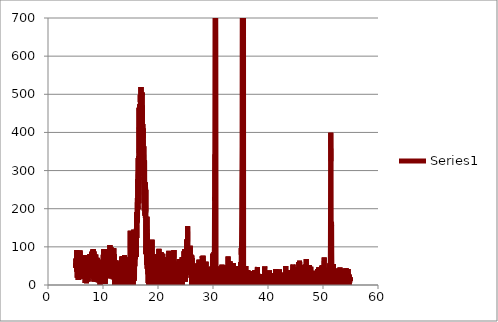
| Category | Series 0 |
|---|---|
| 5.01 | 57.4 |
| 5.03 | 44.9 |
| 5.05 | 57.3 |
| 5.07 | 69.4 |
| 5.09 | 67.3 |
| 5.11 | 54.8 |
| 5.13 | 53.4 |
| 5.15 | 51.7 |
| 5.17 | 62.1 |
| 5.19 | 56.9 |
| 5.21 | 77.2 |
| 5.23 | 91.5 |
| 5.25 | 35.1 |
| 5.27 | 86.2 |
| 5.29 | 45.9 |
| 5.31 | 18.8 |
| 5.33 | 63.1 |
| 5.35 | 52.1 |
| 5.37 | 83.4 |
| 5.39 | 27.9 |
| 5.41 | 89.2 |
| 5.43 | 69.1 |
| 5.45 | 62.8 |
| 5.47 | 74.3 |
| 5.49 | 84.9 |
| 5.51 | 13.3 |
| 5.53 | 38.4 |
| 5.55 | 59.9 |
| 5.57 | 46.9 |
| 5.59 | 13.8 |
| 5.61 | 49 |
| 5.63 | 58.2 |
| 5.65 | 54.4 |
| 5.67 | 22.3 |
| 5.69 | 56.9 |
| 5.71 | 47.3 |
| 5.73 | 47.7 |
| 5.75 | 51 |
| 5.769999999999999 | 86.6 |
| 5.79 | 61.9 |
| 5.81 | 90.3 |
| 5.83 | 52.1 |
| 5.85 | 49.2 |
| 5.87 | 25.2 |
| 5.89 | 34.2 |
| 5.91 | 38.9 |
| 5.93 | 71.2 |
| 5.95 | 38.5 |
| 5.97 | 43.8 |
| 5.99 | 57.6 |
| 6.01 | 18.2 |
| 6.03 | 44.4 |
| 6.05 | 30.3 |
| 6.07 | 46.4 |
| 6.09 | 41.7 |
| 6.11 | 77.2 |
| 6.13 | 36.8 |
| 6.15 | 59.5 |
| 6.17 | 66.2 |
| 6.19 | 35.4 |
| 6.21 | 49.4 |
| 6.23 | 48.8 |
| 6.25 | 67.2 |
| 6.27 | 43.5 |
| 6.29 | 16.2 |
| 6.31 | 51.6 |
| 6.33 | 18.6 |
| 6.35 | 33.3 |
| 6.37 | 42 |
| 6.39 | 58.6 |
| 6.41 | 44.4 |
| 6.43 | 35.9 |
| 6.45 | 21.2 |
| 6.47 | 36 |
| 6.49 | 69.8 |
| 6.51 | 37.5 |
| 6.53 | 56.8 |
| 6.55 | 55.1 |
| 6.57 | 47.9 |
| 6.59 | 27.6 |
| 6.61 | 28.3 |
| 6.63 | 68.8 |
| 6.65 | 47.8 |
| 6.67 | 78.8 |
| 6.69 | 52.4 |
| 6.71 | 42 |
| 6.73 | 34.6 |
| 6.75 | 5.4 |
| 6.769999999999999 | 20.2 |
| 6.79 | 69.4 |
| 6.81 | 31.7 |
| 6.83 | 39.8 |
| 6.85 | 14.5 |
| 6.87 | 59.6 |
| 6.89 | 73.2 |
| 6.91 | 14.4 |
| 6.93 | 50.4 |
| 6.95 | 75.3 |
| 6.97 | 25.1 |
| 6.99 | 4.4 |
| 7.01 | 63.5 |
| 7.03 | 36.2 |
| 7.05 | 33.2 |
| 7.07 | 51.8 |
| 7.09 | 22.1 |
| 7.11 | 55.3 |
| 7.13 | 57.3 |
| 7.15 | 30.3 |
| 7.17 | 36.6 |
| 7.19 | 32.8 |
| 7.21 | 12.3 |
| 7.23 | 33.7 |
| 7.25 | 49.6 |
| 7.27 | 9.1 |
| 7.29 | 51.2 |
| 7.31 | 60.1 |
| 7.33 | 37.9 |
| 7.35 | 39.6 |
| 7.37 | 34.4 |
| 7.39 | 64.2 |
| 7.41 | 66.5 |
| 7.43 | 76.3 |
| 7.45 | 21.2 |
| 7.47 | 54.8 |
| 7.49 | 64.9 |
| 7.51 | 35.3 |
| 7.53 | 28.5 |
| 7.55 | 19.4 |
| 7.57 | 31 |
| 7.59 | 64.3 |
| 7.61 | 80.9 |
| 7.63 | 63 |
| 7.65 | 41.9 |
| 7.67 | 37 |
| 7.69 | 46.8 |
| 7.71 | 45.6 |
| 7.73 | 58.6 |
| 7.75 | 49.9 |
| 7.769999999999999 | 48.1 |
| 7.79 | 23.7 |
| 7.81 | 24.7 |
| 7.83 | 62.1 |
| 7.85 | 59.7 |
| 7.87 | 41.2 |
| 7.89 | 50.7 |
| 7.91 | 36.9 |
| 7.93 | 85.9 |
| 7.95 | 18.6 |
| 7.97 | 32.3 |
| 7.99 | 81.6 |
| 8.01 | 75.2 |
| 8.03 | 77.7 |
| 8.05 | 88.3 |
| 8.07 | 60 |
| 8.09 | 55.2 |
| 8.11 | 52.8 |
| 8.13 | 60.8 |
| 8.15 | 92.3 |
| 8.17 | 94.3 |
| 8.19 | 57 |
| 8.21 | 41.7 |
| 8.23 | 94.1 |
| 8.25 | 71.7 |
| 8.27 | 48.2 |
| 8.29 | 17.1 |
| 8.31 | 67.1 |
| 8.33 | 45.6 |
| 8.35 | 88.1 |
| 8.37 | 9.4 |
| 8.39 | 60.8 |
| 8.41 | 48.3 |
| 8.43 | 74.2 |
| 8.45 | 53.9 |
| 8.47 | 54.1 |
| 8.49 | 40.5 |
| 8.51 | 64.4 |
| 8.53 | 55.3 |
| 8.55 | 42.7 |
| 8.57 | 73 |
| 8.59 | 32.1 |
| 8.61 | 70.4 |
| 8.63 | 58.1 |
| 8.65 | 19.4 |
| 8.67 | 52.5 |
| 8.69 | 79.7 |
| 8.71 | 39 |
| 8.73 | 31.7 |
| 8.75 | 22.2 |
| 8.77 | 36.6 |
| 8.79 | 25.9 |
| 8.81 | 41.7 |
| 8.83 | 47.4 |
| 8.85 | 8 |
| 8.87 | 6.9 |
| 8.89 | 24 |
| 8.91 | 71.2 |
| 8.93 | 26.6 |
| 8.95 | 61.5 |
| 8.97 | 70.2 |
| 8.99 | 55.7 |
| 9.01 | 51.8 |
| 9.03 | 20 |
| 9.05 | 27.1 |
| 9.07 | 16.5 |
| 9.09 | 14.2 |
| 9.11 | 24.7 |
| 9.13 | 34.8 |
| 9.15 | 7 |
| 9.17 | 17 |
| 9.19 | 58.1 |
| 9.21 | 33.1 |
| 9.23 | 39.7 |
| 9.25 | 23.4 |
| 9.27 | 40.8 |
| 9.29 | 41 |
| 9.31 | 45.9 |
| 9.33 | 32.9 |
| 9.35 | 61.2 |
| 9.37 | 40.1 |
| 9.39 | 29 |
| 9.41 | 25.7 |
| 9.43 | 48.7 |
| 9.45 | 43.9 |
| 9.47 | -6.4 |
| 9.49 | 30.9 |
| 9.51 | 26.1 |
| 9.53 | 24 |
| 9.55 | 51.3 |
| 9.57 | 66.5 |
| 9.59 | 28.6 |
| 9.61 | 34.6 |
| 9.63 | 59.7 |
| 9.65 | 15.6 |
| 9.67 | 6.9 |
| 9.69 | 51.3 |
| 9.71 | 35.6 |
| 9.73 | 63.9 |
| 9.75 | 40.6 |
| 9.77 | 42.9 |
| 9.79 | 4.4 |
| 9.81 | 38.5 |
| 9.83 | 34.6 |
| 9.85 | 30.6 |
| 9.87 | 29.4 |
| 9.89 | 8.5 |
| 9.91 | 40 |
| 9.93 | 53.5 |
| 9.95 | 53.5 |
| 9.97 | 40.5 |
| 9.99 | 56.3 |
| 10.01 | 24.3 |
| 10.03 | 43.9 |
| 10.05 | 79.5 |
| 10.07 | 51.2 |
| 10.09 | 41.8 |
| 10.11 | 28.8 |
| 10.13 | 93.5 |
| 10.15 | 40.6 |
| 10.17 | 35.3 |
| 10.19 | 27.5 |
| 10.21 | 19.8 |
| 10.23 | 18.5 |
| 10.25 | 52.2 |
| 10.27 | 13.6 |
| 10.29 | 44.3 |
| 10.31 | 44.7 |
| 10.33 | 54.9 |
| 10.35 | 38.5 |
| 10.37 | 80.1 |
| 10.39 | 50.4 |
| 10.41 | 79.9 |
| 10.43 | 3.4 |
| 10.45 | 60.3 |
| 10.47 | 38.7 |
| 10.49 | 22.2 |
| 10.51 | 81.2 |
| 10.53 | 46 |
| 10.55 | 70.2 |
| 10.57 | 76.3 |
| 10.59 | 86 |
| 10.61 | 36 |
| 10.63 | 21.1 |
| 10.65 | 74.7 |
| 10.67 | 20.6 |
| 10.69 | 27.1 |
| 10.71 | 41.4 |
| 10.73 | 72 |
| 10.75 | 46.6 |
| 10.77 | 44.2 |
| 10.79 | 85.4 |
| 10.81 | 31.8 |
| 10.83 | 62.6 |
| 10.85 | 37.7 |
| 10.87 | 76 |
| 10.89 | 42.8 |
| 10.91 | 62.4 |
| 10.93 | 33.5 |
| 10.95 | 24.3 |
| 10.97 | 58.9 |
| 10.99 | 93.7 |
| 11.01 | 55.8 |
| 11.03 | 45.1 |
| 11.05 | 57.9 |
| 11.07 | 52.6 |
| 11.09 | 35.3 |
| 11.11 | 71.1 |
| 11.13 | 37.6 |
| 11.15 | 48 |
| 11.17 | 48.8 |
| 11.19 | 74.9 |
| 11.21 | 42.1 |
| 11.23 | 17.9 |
| 11.25 | 104.8 |
| 11.27 | 81.4 |
| 11.29 | 55 |
| 11.31 | 52.4 |
| 11.33 | 44.1 |
| 11.35 | 69.9 |
| 11.37 | 62.8 |
| 11.39 | 43.8 |
| 11.41 | 50.4 |
| 11.43 | 47.3 |
| 11.45 | 98.8 |
| 11.47 | 49.5 |
| 11.49 | 17.9 |
| 11.51 | 96.5 |
| 11.53 | 86 |
| 11.55 | 59.9 |
| 11.57 | 41.2 |
| 11.59 | 24.5 |
| 11.61 | 71.8 |
| 11.63 | 58.8 |
| 11.65 | 40.6 |
| 11.67 | 61.6 |
| 11.69 | 50.7 |
| 11.71 | 34.9 |
| 11.73 | 48 |
| 11.75 | 29.1 |
| 11.77 | 44.9 |
| 11.79 | 49.1 |
| 11.81 | 56.9 |
| 11.83 | 41.5 |
| 11.85 | 14.9 |
| 11.87 | 31.3 |
| 11.89 | 55.6 |
| 11.91 | 57.7 |
| 11.93 | 46.9 |
| 11.95 | 96.6 |
| 11.97 | 35.2 |
| 11.99 | 43.9 |
| 12.01 | 25.8 |
| 12.03 | 80.5 |
| 12.05 | 59.8 |
| 12.07 | 31.4 |
| 12.09 | 8.7 |
| 12.11 | 24.3 |
| 12.13 | 42.9 |
| 12.15 | -8.8 |
| 12.17 | 32.8 |
| 12.19 | 59.2 |
| 12.21 | 42.3 |
| 12.23 | 25.6 |
| 12.25 | 37 |
| 12.27 | 19.5 |
| 12.29 | 41.4 |
| 12.31 | -2.3 |
| 12.33 | 34.7 |
| 12.35 | 8 |
| 12.37 | 64.4 |
| 12.39 | 37.3 |
| 12.41 | 61.1 |
| 12.43 | 3.9 |
| 12.45 | 51.3 |
| 12.47 | 57.4 |
| 12.49 | 60.2 |
| 12.51 | 31.1 |
| 12.53 | 36.3 |
| 12.55 | 50.5 |
| 12.57 | 29.1 |
| 12.59 | 38.2 |
| 12.61 | 50 |
| 12.63 | 58.9 |
| 12.65 | 10.4 |
| 12.67 | 50.3 |
| 12.69 | 27.3 |
| 12.71 | 29.3 |
| 12.73 | 33 |
| 12.75 | 43.5 |
| 12.77 | 43.6 |
| 12.79 | 20.2 |
| 12.81 | 15.3 |
| 12.83 | 22.1 |
| 12.85 | 36.4 |
| 12.87 | 9.4 |
| 12.89 | 53.4 |
| 12.91 | 13.8 |
| 12.93 | -1 |
| 12.95 | 55.1 |
| 12.97 | 5 |
| 12.99 | 57 |
| 13.01 | 2.7 |
| 13.03 | 39 |
| 13.05 | 57.6 |
| 13.07 | 29.8 |
| 13.09 | 10.2 |
| 13.11 | 9.7 |
| 13.13 | 43.4 |
| 13.15 | -1.9 |
| 13.17 | 39.4 |
| 13.19 | 33 |
| 13.21 | 35.5 |
| 13.23 | 29.1 |
| 13.25 | 51.1 |
| 13.27 | -0.6 |
| 13.29 | 27.8 |
| 13.31 | 19.5 |
| 13.33 | -8.2 |
| 13.35 | 51.4 |
| 13.37 | 74.4 |
| 13.39 | 27.5 |
| 13.41 | 64.6 |
| 13.43 | 17 |
| 13.45 | -3.1 |
| 13.47 | 39.7 |
| 13.49 | 27.3 |
| 13.51 | 49.3 |
| 13.53 | 67.5 |
| 13.55 | 75.3 |
| 13.57 | 37.5 |
| 13.59 | -13.1 |
| 13.61 | 0.6 |
| 13.63 | 15.7 |
| 13.65 | 9 |
| 13.67 | 31.5 |
| 13.69 | 39.5 |
| 13.71 | 56.7 |
| 13.73 | 50.6 |
| 13.75 | 30.2 |
| 13.77 | 28.4 |
| 13.79 | 54.1 |
| 13.81 | 58.5 |
| 13.83 | -6.4 |
| 13.85 | 21.4 |
| 13.87 | -12.5 |
| 13.89 | 8 |
| 13.91 | 23.7 |
| 13.93 | 77.9 |
| 13.95 | 19.1 |
| 13.97 | 30 |
| 13.99 | 24.8 |
| 14.01 | 23.7 |
| 14.03 | 41.3 |
| 14.05 | 58.2 |
| 14.07 | 15.3 |
| 14.09 | -1.4 |
| 14.11 | 41.7 |
| 14.13 | 42.9 |
| 14.15 | 8.4 |
| 14.17 | 31 |
| 14.19 | 54.3 |
| 14.21 | 18.1 |
| 14.23 | 35.1 |
| 14.25 | 22.6 |
| 14.27 | -4.8 |
| 14.29 | 38.5 |
| 14.31 | 27.7 |
| 14.33 | 15 |
| 14.35 | 61.6 |
| 14.37 | 4.1 |
| 14.39 | -9.1 |
| 14.41 | 8.7 |
| 14.43 | 28.5 |
| 14.45 | -0.4 |
| 14.47 | 46 |
| 14.49 | 40.1 |
| 14.51 | 43.8 |
| 14.53 | 20.4 |
| 14.55 | -5.1 |
| 14.57 | 61.9 |
| 14.59 | 19.3 |
| 14.61 | 7 |
| 14.63 | -27.5 |
| 14.65 | 42.3 |
| 14.67 | 70.4 |
| 14.69 | 46.7 |
| 14.71 | 24.1 |
| 14.73 | 24.5 |
| 14.75 | 19.3 |
| 14.77 | 44.7 |
| 14.79 | -14 |
| 14.81 | 50.2 |
| 14.83 | 62 |
| 14.85 | 73.6 |
| 14.87 | 63.1 |
| 14.89 | 67.4 |
| 14.91 | 3.6 |
| 14.93 | 52.4 |
| 14.95 | 142.2 |
| 14.97 | 50.1 |
| 14.99 | 63 |
| 15.01 | 49.6 |
| 15.03 | 24.1 |
| 15.05 | 39.2 |
| 15.07 | 69.7 |
| 15.09 | 44.3 |
| 15.11 | 45.9 |
| 15.13 | 44.1 |
| 15.15 | 72.7 |
| 15.17 | 66.9 |
| 15.19 | 20.2 |
| 15.21 | 63.3 |
| 15.23 | 55.6 |
| 15.25 | 31.6 |
| 15.27 | 50.8 |
| 15.29 | 22 |
| 15.31 | 57.2 |
| 15.33 | 73.8 |
| 15.35 | 101.2 |
| 15.37 | 110.8 |
| 15.39 | -19.5 |
| 15.41 | 83.2 |
| 15.43 | 92.2 |
| 15.45 | 46.2 |
| 15.47 | 27.2 |
| 15.49 | -9.1 |
| 15.51 | 88.5 |
| 15.53 | 45.7 |
| 15.55 | 121.3 |
| 15.57 | 26.3 |
| 15.59 | 144.8 |
| 15.61 | 101 |
| 15.63 | 80.2 |
| 15.65 | 33.8 |
| 15.67 | 11.2 |
| 15.69 | 80.1 |
| 15.71 | 137.6 |
| 15.73 | 15.7 |
| 15.75 | 62.3 |
| 15.77 | 125.5 |
| 15.79 | 49 |
| 15.81 | 103.6 |
| 15.83 | 106.9 |
| 15.85 | 68.1 |
| 15.87 | 126.9 |
| 15.89 | 105.3 |
| 15.91 | 75 |
| 15.93 | 75.8 |
| 15.95 | 78.5 |
| 15.97 | 133.4 |
| 15.99 | 96.7 |
| 16.01 | 130.6 |
| 16.03 | 73.3 |
| 16.05 | 140.1 |
| 16.07 | 149.1 |
| 16.09 | 184.9 |
| 16.11 | 190.6 |
| 16.13 | 123.4 |
| 16.15 | 157.6 |
| 16.17 | 161.1 |
| 16.19 | 181.9 |
| 16.21 | 172 |
| 16.23 | 216.6 |
| 16.25 | 228 |
| 16.27 | 164.8 |
| 16.29 | 192 |
| 16.31 | 205.9 |
| 16.33 | 278.1 |
| 16.35 | 198.3 |
| 16.37 | 206.9 |
| 16.39 | 332.7 |
| 16.41 | 267.2 |
| 16.43 | 290.4 |
| 16.45 | 337.4 |
| 16.47 | 222.9 |
| 16.49 | 304.3 |
| 16.51 | 214.6 |
| 16.53 | 273.3 |
| 16.55 | 464.9 |
| 16.57 | 346 |
| 16.59 | 328.8 |
| 16.61 | 413 |
| 16.63 | 398.8 |
| 16.65 | 375.6 |
| 16.67 | 459 |
| 16.69 | 474.1 |
| 16.71 | 429.9 |
| 16.73 | 372.9 |
| 16.75 | 385.1 |
| 16.77 | 425 |
| 16.79 | 498.7 |
| 16.81 | 432.8 |
| 16.83 | 437.8 |
| 16.85 | 345.2 |
| 16.87 | 436 |
| 16.89 | 426.6 |
| 16.91 | 519.3 |
| 16.93 | 484.9 |
| 16.95 | 438.9 |
| 16.97 | 462.9 |
| 16.99 | 494 |
| 17.01 | 489.6 |
| 17.03 | 464.5 |
| 17.05 | 445.2 |
| 17.07 | 464.5 |
| 17.09 | 371.8 |
| 17.11 | 409.4 |
| 17.13 | 504.5 |
| 17.15 | 495.7 |
| 17.17 | 443.7 |
| 17.19 | 417.4 |
| 17.21 | 408.4 |
| 17.23 | 422.1 |
| 17.25 | 363 |
| 17.27 | 380.1 |
| 17.29 | 397.3 |
| 17.31 | 410.3 |
| 17.33 | 384.9 |
| 17.35 | 353.2 |
| 17.37 | 339.7 |
| 17.39 | 286.7 |
| 17.41 | 364 |
| 17.43 | 274.6 |
| 17.45 | 283.9 |
| 17.47 | 264.5 |
| 17.49 | 195.3 |
| 17.51 | 253.3 |
| 17.53 | 283.7 |
| 17.55 | 327.4 |
| 17.57 | 322.5 |
| 17.59 | 218.4 |
| 17.61 | 206.2 |
| 17.63 | 232.2 |
| 17.65 | 181.8 |
| 17.67 | 207.8 |
| 17.69 | 218.8 |
| 17.71 | 175.9 |
| 17.73 | 268.9 |
| 17.75 | 188.6 |
| 17.77 | 249.6 |
| 17.79 | 80.9 |
| 17.81 | 105.5 |
| 17.83 | 129.5 |
| 17.85 | 177.5 |
| 17.87 | 144.7 |
| 17.89 | 125 |
| 17.91 | 53.1 |
| 17.93 | 122.5 |
| 17.95 | 146 |
| 17.97 | 61 |
| 17.99 | 178.9 |
| 18.01 | 84 |
| 18.03 | 135.3 |
| 18.05 | 42.8 |
| 18.07 | 67.1 |
| 18.09 | 70.8 |
| 18.11 | 39 |
| 18.13 | 59.1 |
| 18.15 | 67.2 |
| 18.17 | 42.9 |
| 18.19 | 28.3 |
| 18.21 | 46.6 |
| 18.23 | 5.3 |
| 18.25 | 61 |
| 18.27 | 3.7 |
| 18.29 | 34.8 |
| 18.31 | 55.5 |
| 18.33 | 37.8 |
| 18.35 | -7.8 |
| 18.37 | 28.6 |
| 18.39 | 22.6 |
| 18.41 | 10.4 |
| 18.43 | -17.2 |
| 18.45 | 48.7 |
| 18.47 | -17.5 |
| 18.49 | 52 |
| 18.51 | -20.2 |
| 18.53 | -12.7 |
| 18.55 | -30 |
| 18.57 | 31.4 |
| 18.59 | 7.1 |
| 18.61 | -31.6 |
| 18.63 | -38.6 |
| 18.65 | -43.4 |
| 18.67 | -9.7 |
| 18.69 | -19.6 |
| 18.71 | 29.2 |
| 18.73 | -0.2 |
| 18.75 | -88.2 |
| 18.77 | -1.3 |
| 18.79 | -18.8 |
| 18.81 | -3.8 |
| 18.83 | 25.9 |
| 18.85 | 2.1 |
| 18.87 | 0.5 |
| 18.89 | -54.4 |
| 18.91 | 118.6 |
| 18.93 | 24 |
| 18.95 | 4.3 |
| 18.97 | 27.9 |
| 18.99 | 33.2 |
| 19.01 | -44.2 |
| 19.03 | -17.8 |
| 19.05 | 3.7 |
| 19.07 | 38.3 |
| 19.09 | -49.5 |
| 19.11 | -1.1 |
| 19.13 | -29.2 |
| 19.15 | 20.5 |
| 19.17 | -0.7 |
| 19.19 | -33.2 |
| 19.21 | 38.8 |
| 19.23 | 25.4 |
| 19.25 | -19.7 |
| 19.27 | -22.4 |
| 19.29 | -31.5 |
| 19.31 | 27.2 |
| 19.33 | 58.6 |
| 19.35 | -69.7 |
| 19.37 | 3.3 |
| 19.39 | -14.1 |
| 19.41 | 37.8 |
| 19.43 | -33.7 |
| 19.45 | -30.8 |
| 19.47 | -21 |
| 19.49 | 34.9 |
| 19.51 | 49.7 |
| 19.53 | 4.9 |
| 19.55 | 17.1 |
| 19.57 | -19.9 |
| 19.59 | 80.5 |
| 19.61 | -45.8 |
| 19.63 | 39.1 |
| 19.65 | 50.8 |
| 19.67 | -46.5 |
| 19.69 | 6.3 |
| 19.71 | -6.4 |
| 19.73 | 64.4 |
| 19.75 | -1.4 |
| 19.77 | 20.8 |
| 19.79 | -38.2 |
| 19.81 | -129.2 |
| 19.83 | -6.9 |
| 19.85 | -15.1 |
| 19.87 | 24.3 |
| 19.89 | -5.5 |
| 19.91 | -2.2 |
| 19.93 | -17 |
| 19.95 | 27.4 |
| 19.97 | 16.3 |
| 19.99 | 46.2 |
| 20.01 | -22.8 |
| 20.03 | -45.7 |
| 20.05 | -31.1 |
| 20.07 | -36.4 |
| 20.09 | -30.7 |
| 20.11 | -31.7 |
| 20.13 | -9.2 |
| 20.15 | -21.3 |
| 20.17 | 94.7 |
| 20.19 | 4.2 |
| 20.21 | -71.3 |
| 20.23 | -18.5 |
| 20.25 | 34.9 |
| 20.27 | -31.3 |
| 20.29 | 6.8 |
| 20.31 | -12 |
| 20.33 | 6.3 |
| 20.35 | 15.1 |
| 20.37 | -47.2 |
| 20.39 | 18.2 |
| 20.41 | 20.3 |
| 20.43 | -8.8 |
| 20.45 | 60.2 |
| 20.47 | -12.4 |
| 20.49 | 20.6 |
| 20.51 | -17.1 |
| 20.53 | -0.4 |
| 20.55 | -5.7 |
| 20.57 | 85.8 |
| 20.59 | -59.6 |
| 20.61 | 4.1 |
| 20.63 | 11.8 |
| 20.65 | 6.1 |
| 20.67 | 3.5 |
| 20.69 | -49.9 |
| 20.71 | 18.9 |
| 20.73 | 14.8 |
| 20.75 | 25.4 |
| 20.77 | 22.9 |
| 20.79 | 34.7 |
| 20.81 | 14.7 |
| 20.83 | -24.1 |
| 20.85 | 20.8 |
| 20.87 | 82.1 |
| 20.89 | 44.2 |
| 20.91 | 51.4 |
| 20.93 | -15.4 |
| 20.95 | -27.7 |
| 20.97 | 38.7 |
| 20.99 | 31.9 |
| 21.01 | 11.9 |
| 21.03 | 64.9 |
| 21.05 | 15.3 |
| 21.07 | 48.1 |
| 21.09 | 19.9 |
| 21.11 | 16.4 |
| 21.13 | 16.6 |
| 21.15 | 42.9 |
| 21.17 | 23.2 |
| 21.19 | 31.3 |
| 21.21 | 55.2 |
| 21.23 | -6.2 |
| 21.25 | -21 |
| 21.27 | -7.6 |
| 21.29 | 60.8 |
| 21.31 | 10.1 |
| 21.33 | 28.8 |
| 21.35 | 34.1 |
| 21.37 | 34 |
| 21.39 | 8.3 |
| 21.41 | 56.5 |
| 21.43 | -51.5 |
| 21.45 | 49.2 |
| 21.47 | -6.6 |
| 21.49 | 3.2 |
| 21.51 | -19.8 |
| 21.53 | 28.9 |
| 21.55 | 72.6 |
| 21.57 | 9.8 |
| 21.59 | -35.9 |
| 21.61 | 35.6 |
| 21.63 | -21.4 |
| 21.65 | 35.5 |
| 21.67 | 35.1 |
| 21.69 | 23.8 |
| 21.71 | -4.9 |
| 21.73 | 57.8 |
| 21.75 | 1.5 |
| 21.77 | 19.7 |
| 21.79 | 54.3 |
| 21.81 | 53 |
| 21.83 | 9 |
| 21.85 | 3.8 |
| 21.87 | 25.8 |
| 21.89 | 26 |
| 21.91 | 15.7 |
| 21.93 | -15.5 |
| 21.95 | 38.6 |
| 21.97 | 89.5 |
| 21.99 | 38.1 |
| 22.01 | 24.8 |
| 22.03 | -22.5 |
| 22.05 | 81.3 |
| 22.07 | 51.2 |
| 22.09 | 13.3 |
| 22.11 | 7.2 |
| 22.13 | 68.6 |
| 22.15 | 0.7 |
| 22.17 | 21.9 |
| 22.19 | 50.1 |
| 22.21 | -7.2 |
| 22.23 | 9.3 |
| 22.25 | 82.7 |
| 22.27 | 37.5 |
| 22.29 | -5.4 |
| 22.31 | 40 |
| 22.33 | 31.2 |
| 22.35 | 60.4 |
| 22.37 | 43.3 |
| 22.39 | 6.6 |
| 22.41 | 59.7 |
| 22.43 | -5.2 |
| 22.45 | 46.9 |
| 22.47 | 30.9 |
| 22.49 | 51.8 |
| 22.51 | -6.3 |
| 22.53 | -47.2 |
| 22.55 | 37.8 |
| 22.57 | 19.1 |
| 22.59 | 26.8 |
| 22.61 | -8.1 |
| 22.63 | 46.9 |
| 22.65 | 47.9 |
| 22.67 | -9 |
| 22.69 | 52.8 |
| 22.71 | 30.3 |
| 22.73 | 12.1 |
| 22.75 | -39.2 |
| 22.77 | 6.6 |
| 22.79 | 48.3 |
| 22.81 | 2 |
| 22.83 | -41.4 |
| 22.85 | 17 |
| 22.87 | -31 |
| 22.89 | 91.7 |
| 22.91 | 71.1 |
| 22.93 | 64.4 |
| 22.95 | 42.2 |
| 22.97 | -0.8 |
| 22.99 | 7.4 |
| 23.01 | -2.6 |
| 23.03 | 33.5 |
| 23.05 | 32.8 |
| 23.07 | -13.6 |
| 23.09 | 46.2 |
| 23.11 | -29.5 |
| 23.13 | 10.1 |
| 23.15 | 17.4 |
| 23.17 | -13.5 |
| 23.19 | 9 |
| 23.21 | 41.3 |
| 23.23 | 13.1 |
| 23.25 | 40.5 |
| 23.27 | -6.2 |
| 23.29 | -16.9 |
| 23.31 | 57.8 |
| 23.33 | 4.9 |
| 23.35 | 46.9 |
| 23.37 | -21.6 |
| 23.39 | -16.3 |
| 23.41 | 8.7 |
| 23.43 | 23.9 |
| 23.45 | 21.1 |
| 23.47 | 33.9 |
| 23.49 | 11.5 |
| 23.51 | -53.6 |
| 23.53 | 13.4 |
| 23.55 | -15.5 |
| 23.57 | 25.7 |
| 23.59 | -4.2 |
| 23.61 | 31.9 |
| 23.63 | 30.3 |
| 23.65 | 61.2 |
| 23.67 | 46.3 |
| 23.69 | 39.1 |
| 23.71 | 58.2 |
| 23.73 | -18.7 |
| 23.75 | 3.4 |
| 23.77 | 25.2 |
| 23.79 | -1.5 |
| 23.81 | 17.4 |
| 23.83 | 5.8 |
| 23.85 | 67.7 |
| 23.87 | -23.1 |
| 23.89 | -17.9 |
| 23.91 | 47.1 |
| 23.93 | -10.3 |
| 23.95 | 41.7 |
| 23.97 | 11 |
| 23.99 | -44.6 |
| 24.01 | 19.6 |
| 24.03 | 17.5 |
| 24.05 | 4.2 |
| 24.07 | 63.4 |
| 24.09 | 15.3 |
| 24.11 | 53.9 |
| 24.13 | 2.7 |
| 24.15 | 49.6 |
| 24.17 | -3.1 |
| 24.19 | 20.1 |
| 24.21 | 34 |
| 24.23 | 19.5 |
| 24.25 | 51.5 |
| 24.27 | 61 |
| 24.29 | 65.6 |
| 24.31 | 21.9 |
| 24.33 | 27.3 |
| 24.35 | 37.1 |
| 24.37 | 24.5 |
| 24.39 | 72.5 |
| 24.41 | -18 |
| 24.43 | 67.6 |
| 24.45 | 38 |
| 24.47 | 36.7 |
| 24.49 | 60.2 |
| 24.51 | 36.3 |
| 24.53 | 26.8 |
| 24.55 | 10.5 |
| 24.57 | 73.3 |
| 24.59 | 35.7 |
| 24.61 | 42.8 |
| 24.63 | 59.7 |
| 24.65 | 37.3 |
| 24.67 | 56.8 |
| 24.69 | 19.6 |
| 24.71 | 42.9 |
| 24.73 | 88.3 |
| 24.75 | 55 |
| 24.77 | 21.2 |
| 24.79 | 39.1 |
| 24.81 | 91.5 |
| 24.83 | 58.8 |
| 24.85 | 82.8 |
| 24.87 | 94.5 |
| 24.89 | 18.7 |
| 24.91 | 67.5 |
| 24.93 | 43.7 |
| 24.95 | 46 |
| 24.97 | 8.4 |
| 24.99 | 30.3 |
| 25.01 | 62 |
| 25.03 | 55 |
| 25.05 | 70.7 |
| 25.07 | 79 |
| 25.09 | 52.1 |
| 25.11 | 88.3 |
| 25.13 | 33.2 |
| 25.15 | 41.4 |
| 25.17 | 69.3 |
| 25.19 | 69.4 |
| 25.21 | 62 |
| 25.23 | 119.4 |
| 25.25 | 55.2 |
| 25.27 | 109.3 |
| 25.29 | 53.2 |
| 25.31 | 89.3 |
| 25.33 | 59.7 |
| 25.35 | 103.5 |
| 25.37 | 55.9 |
| 25.39 | 154.1 |
| 25.41 | 26.1 |
| 25.43 | 87.6 |
| 25.45 | 48 |
| 25.47 | 102 |
| 25.49 | 87.4 |
| 25.51 | 54.4 |
| 25.53 | 83.5 |
| 25.55 | 100.9 |
| 25.57 | 72.4 |
| 25.59 | 42.7 |
| 25.61 | 82.9 |
| 25.63 | 71.2 |
| 25.65 | 67.3 |
| 25.67 | 75.2 |
| 25.69 | 101 |
| 25.71 | 43.2 |
| 25.73 | 90.9 |
| 25.75 | 98 |
| 25.77 | 71.9 |
| 25.79 | 41.7 |
| 25.81 | 78.5 |
| 25.83 | 42.2 |
| 25.85 | 73.7 |
| 25.87 | 102.7 |
| 25.89 | 90.3 |
| 25.91 | 62.3 |
| 25.93 | 74.7 |
| 25.95 | 56.1 |
| 25.97 | 37 |
| 25.99 | 19.2 |
| 26.01 | 37.9 |
| 26.03 | 41.4 |
| 26.05 | 79.1 |
| 26.07 | 57.4 |
| 26.09 | 24.9 |
| 26.11 | 8 |
| 26.13 | 77.3 |
| 26.15 | 51.1 |
| 26.17 | 70.8 |
| 26.19 | -1.6 |
| 26.21 | 63.8 |
| 26.23 | -24.6 |
| 26.25 | 20.5 |
| 26.27 | 29.9 |
| 26.29 | 28.2 |
| 26.31 | 27.4 |
| 26.33 | 30 |
| 26.35 | 9.3 |
| 26.37 | 19.1 |
| 26.39 | 7.6 |
| 26.41 | 11.2 |
| 26.43 | 45.3 |
| 26.45 | 38.7 |
| 26.47 | 36.9 |
| 26.49 | 28.2 |
| 26.51 | 33.9 |
| 26.53 | 45.5 |
| 26.55 | 24.2 |
| 26.57 | 27.9 |
| 26.59 | -13.3 |
| 26.61 | 46.1 |
| 26.63 | 14.9 |
| 26.65 | 18.6 |
| 26.67 | 21 |
| 26.69 | 30.4 |
| 26.71 | 49.7 |
| 26.73 | -16.9 |
| 26.75 | -20.3 |
| 26.77 | -0.9 |
| 26.79 | 31 |
| 26.81 | 36.9 |
| 26.83 | 30.8 |
| 26.85 | 46.3 |
| 26.87 | -9.7 |
| 26.89 | 39.1 |
| 26.91 | 56.1 |
| 26.93 | 3.5 |
| 26.95 | 15.7 |
| 26.97 | 7.3 |
| 26.99 | 0 |
| 27.01 | 23.2 |
| 27.03 | 8.7 |
| 27.05 | 36.3 |
| 27.07 | -5.2 |
| 27.09 | -50.4 |
| 27.11 | 46.7 |
| 27.13 | 31.9 |
| 27.15 | 45.3 |
| 27.17 | 8.2 |
| 27.19 | 13.5 |
| 27.21 | 36.6 |
| 27.23 | -29 |
| 27.25 | 10.3 |
| 27.27 | 25.3 |
| 27.29 | 6.9 |
| 27.31 | 2.5 |
| 27.33 | 13.9 |
| 27.35 | 10.7 |
| 27.37 | -14.6 |
| 27.39 | 19.5 |
| 27.41 | -8 |
| 27.43 | 4.9 |
| 27.45 | -11 |
| 27.47 | 66.5 |
| 27.49 | 27.8 |
| 27.51 | -40.4 |
| 27.53 | 5.4 |
| 27.55 | 28.1 |
| 27.57 | 23.8 |
| 27.59 | -9.8 |
| 27.61 | -27.5 |
| 27.63 | 32.5 |
| 27.65 | 41.8 |
| 27.67 | -34.8 |
| 27.69 | 25.4 |
| 27.71 | -0.9 |
| 27.73 | -4.8 |
| 27.75 | 23.4 |
| 27.77 | -7 |
| 27.79 | 1.9 |
| 27.81 | 23.5 |
| 27.83 | 18.8 |
| 27.85 | 14.3 |
| 27.87 | 31.6 |
| 27.89 | 56.4 |
| 27.91 | -16.1 |
| 27.93 | -0.6 |
| 27.95 | 22.5 |
| 27.97 | 42.3 |
| 27.99 | -3.5 |
| 28.01 | 52.1 |
| 28.03 | 16.6 |
| 28.05 | 75.5 |
| 28.07 | 70.4 |
| 28.09 | 21.3 |
| 28.11 | 30.7 |
| 28.13 | 66.7 |
| 28.15 | 13.2 |
| 28.17 | 76.9 |
| 28.19 | 40.8 |
| 28.21 | 43.6 |
| 28.23 | 39.2 |
| 28.25 | 37.6 |
| 28.27 | 32.6 |
| 28.29 | -26.2 |
| 28.31 | -11.1 |
| 28.33 | -23.1 |
| 28.35 | -43.7 |
| 28.37 | -21.2 |
| 28.39 | -13.7 |
| 28.41 | -56.2 |
| 28.43 | 29.7 |
| 28.45 | -16.1 |
| 28.47 | -29.8 |
| 28.49 | -7.1 |
| 28.51 | -31.2 |
| 28.53 | 26.1 |
| 28.55 | 13.1 |
| 28.57 | 6.9 |
| 28.59 | -18.5 |
| 28.61 | -50.1 |
| 28.63 | 47.5 |
| 28.65 | 26.3 |
| 28.67 | 25.4 |
| 28.69 | -3.1 |
| 28.71 | 61.1 |
| 28.73 | 60.4 |
| 28.75 | 3.4 |
| 28.77 | 12.8 |
| 28.79 | 18.7 |
| 28.81 | 2 |
| 28.83 | 6.3 |
| 28.85 | 29 |
| 28.87 | 39.5 |
| 28.89 | 21.3 |
| 28.91 | 28.2 |
| 28.93 | 10.1 |
| 28.95 | 30.6 |
| 28.97 | -3.4 |
| 28.99 | 28.9 |
| 29.01 | 11.5 |
| 29.03 | 22.7 |
| 29.05 | 16.7 |
| 29.07 | 16.7 |
| 29.09 | 43.9 |
| 29.11 | -2.2 |
| 29.13 | 6.2 |
| 29.15 | -5 |
| 29.17 | -14.3 |
| 29.19 | 8.7 |
| 29.21 | 15.2 |
| 29.23 | -29.7 |
| 29.25 | 18.4 |
| 29.27 | 46.5 |
| 29.29 | -44 |
| 29.31 | -14.5 |
| 29.33 | 16.6 |
| 29.35 | -6.7 |
| 29.37 | 20.1 |
| 29.39 | 17.3 |
| 29.41 | 13.9 |
| 29.43 | 21.2 |
| 29.45 | 16.7 |
| 29.47 | 11.9 |
| 29.49 | 15.1 |
| 29.51 | 36.2 |
| 29.53 | 31.1 |
| 29.55 | 21.1 |
| 29.57 | 13.6 |
| 29.59 | -3.9 |
| 29.61 | -31.1 |
| 29.63 | -22.1 |
| 29.65 | -2.8 |
| 29.67 | 22.7 |
| 29.69 | 30.6 |
| 29.71 | 48.2 |
| 29.73 | 11 |
| 29.75 | -1.9 |
| 29.77 | 4.9 |
| 29.79 | 33.3 |
| 29.81 | 38.4 |
| 29.83 | -1.8 |
| 29.85 | 36.7 |
| 29.87 | -8.3 |
| 29.89 | 15.2 |
| 29.91 | 81.7 |
| 29.93 | 15.4 |
| 29.95 | -1.6 |
| 29.97 | 40.1 |
| 29.99 | 61.1 |
| 30.01 | -6 |
| 30.03 | 12.9 |
| 30.05 | -25 |
| 30.07 | 30.7 |
| 30.09 | 1.1 |
| 30.11 | 15.5 |
| 30.13 | 42.8 |
| 30.15 | 41.7 |
| 30.17 | 86.6 |
| 30.19 | 44.9 |
| 30.21 | 64.4 |
| 30.23 | 75.9 |
| 30.25 | 104.5 |
| 30.27 | 178.8 |
| 30.29 | 230.5 |
| 30.31 | 221.4 |
| 30.33 | 342.9 |
| 30.35 | 500.6 |
| 30.37 | 685.2 |
| 30.39 | 972 |
| 30.41 | 1221.5 |
| 30.43 | 1241.9 |
| 30.45 | 1176.4 |
| 30.47 | 977.4 |
| 30.49 | 729.6 |
| 30.51 | 651.8 |
| 30.53 | 384.6 |
| 30.55 | 95.8 |
| 30.57 | -200.5 |
| 30.59 | -398.9 |
| 30.61 | -497.4 |
| 30.63 | -531.1 |
| 30.65 | -525.2 |
| 30.67 | -392.5 |
| 30.69 | -257.2 |
| 30.71 | -212.6 |
| 30.73 | -135 |
| 30.75 | -111.5 |
| 30.77 | -33 |
| 30.79 | -22.4 |
| 30.81 | -8.3 |
| 30.83 | -26.4 |
| 30.85 | -38.3 |
| 30.87 | -26.4 |
| 30.89 | -5.6 |
| 30.91 | 1 |
| 30.93 | 33.9 |
| 30.95 | 13.9 |
| 30.97 | -30.6 |
| 30.99 | 43.8 |
| 31.01 | 38.1 |
| 31.03 | 39.9 |
| 31.05 | 47.9 |
| 31.07 | 18.9 |
| 31.09 | -13.1 |
| 31.11 | 16 |
| 31.13 | 30.5 |
| 31.15 | 13.2 |
| 31.17 | 22.1 |
| 31.19 | 40.8 |
| 31.21 | 26 |
| 31.23 | -33.5 |
| 31.25 | 12.4 |
| 31.27 | 26 |
| 31.29 | 48.1 |
| 31.31 | 26.7 |
| 31.33 | 28.4 |
| 31.35 | 26.5 |
| 31.37 | 47.3 |
| 31.39 | 34.4 |
| 31.41 | 14.3 |
| 31.43 | -7.7 |
| 31.45 | 26.9 |
| 31.47 | 13.7 |
| 31.49 | -13.3 |
| 31.51 | 27.7 |
| 31.53 | 4.1 |
| 31.55 | 11.2 |
| 31.57 | 17.3 |
| 31.59 | 45.4 |
| 31.61 | -4.6 |
| 31.63 | -15.3 |
| 31.65 | 53.2 |
| 31.67 | 29.2 |
| 31.69 | 3.1 |
| 31.71 | 7.8 |
| 31.73 | -4.1 |
| 31.75 | -16.6 |
| 31.77 | -9.6 |
| 31.79 | 24 |
| 31.81 | 31.5 |
| 31.83 | 24.7 |
| 31.85 | 31.4 |
| 31.87 | -27.1 |
| 31.89 | 9.1 |
| 31.91 | 20.1 |
| 31.93 | 39.1 |
| 31.95 | 4.4 |
| 31.97 | 0.7 |
| 31.99 | 17 |
| 32.01 | 51.1 |
| 32.03 | 0.7 |
| 32.05 | -3.4 |
| 32.07 | 9.8 |
| 32.09 | 14.8 |
| 32.11 | 29.6 |
| 32.13 | 21.6 |
| 32.15 | -18.6 |
| 32.17 | 50.2 |
| 32.19 | 39.5 |
| 32.21 | -14.3 |
| 32.23 | -10.8 |
| 32.25 | 38.3 |
| 32.27 | -4.6 |
| 32.29 | -20 |
| 32.31 | 43.2 |
| 32.33 | 14.1 |
| 32.35 | 44.3 |
| 32.37 | 12.2 |
| 32.39 | 35 |
| 32.41 | 19.7 |
| 32.43 | -9.3 |
| 32.45 | 15.2 |
| 32.47 | 21 |
| 32.49 | 17 |
| 32.51 | -6.7 |
| 32.53 | -5.6 |
| 32.55 | -8.8 |
| 32.57 | -27.2 |
| 32.59 | 8.2 |
| 32.61 | 20.4 |
| 32.63 | 18.1 |
| 32.65 | 12.9 |
| 32.67 | 22.8 |
| 32.69 | 23.1 |
| 32.71 | 10.5 |
| 32.73 | 44.1 |
| 32.75 | 74.5 |
| 32.77 | -5.2 |
| 32.79 | 48.4 |
| 32.81 | 7.5 |
| 32.83 | 7.9 |
| 32.85 | 19.7 |
| 32.87 | 14.8 |
| 32.89 | -1.3 |
| 32.91 | 30.6 |
| 32.93 | 24 |
| 32.95 | 24.2 |
| 32.97 | 27.6 |
| 32.99 | -0.7 |
| 33.01 | 22.6 |
| 33.03 | 28.4 |
| 33.05 | 33.5 |
| 33.07 | -7.5 |
| 33.09 | -12.6 |
| 33.11 | 61.9 |
| 33.13 | 36.1 |
| 33.15 | 32 |
| 33.17 | 20.1 |
| 33.19 | 16.6 |
| 33.21 | 43.5 |
| 33.23 | 44.9 |
| 33.25 | -13.6 |
| 33.27 | -3.3 |
| 33.29 | 11.7 |
| 33.31 | 1.7 |
| 33.33 | 27.7 |
| 33.35 | 23.8 |
| 33.37 | -6.9 |
| 33.39 | -22.5 |
| 33.41 | 24.1 |
| 33.43 | 25.3 |
| 33.45 | 9.4 |
| 33.47 | 9.5 |
| 33.49 | -1.5 |
| 33.51 | -16.2 |
| 33.53 | 2.5 |
| 33.55 | 49.4 |
| 33.57 | 6.3 |
| 33.59 | -22.3 |
| 33.61 | 8.3 |
| 33.63 | 40.8 |
| 33.65 | 3.3 |
| 33.67 | 48.1 |
| 33.69 | 0.4 |
| 33.71 | 16.5 |
| 33.73 | 57.4 |
| 33.75 | 22.3 |
| 33.77 | 10.6 |
| 33.79 | -5.1 |
| 33.81 | -13.6 |
| 33.83 | 18.6 |
| 33.85 | -0.3 |
| 33.87 | 7.6 |
| 33.89 | -11.6 |
| 33.91 | -12.5 |
| 33.93 | 21.7 |
| 33.95 | -17.7 |
| 33.97 | 15.2 |
| 33.99 | 24.2 |
| 34.01 | 16.7 |
| 34.03 | -20.8 |
| 34.05 | -5 |
| 34.07 | 26.7 |
| 34.09 | 16 |
| 34.11 | 17.9 |
| 34.13 | 2.8 |
| 34.15 | 23.5 |
| 34.17 | 2.1 |
| 34.19 | -15.6 |
| 34.21 | -10 |
| 34.23 | 15.7 |
| 34.25 | -10.6 |
| 34.27 | 5.1 |
| 34.29 | 5.1 |
| 34.31 | 45.2 |
| 34.33 | 0.2 |
| 34.35 | -3.9 |
| 34.37 | -4 |
| 34.39 | 1.7 |
| 34.41 | 21.8 |
| 34.43 | 4.6 |
| 34.45 | 26.3 |
| 34.47 | -0.2 |
| 34.49 | 49.1 |
| 34.51 | -7.5 |
| 34.53 | -20.2 |
| 34.55 | 33.4 |
| 34.57 | 13 |
| 34.59 | -28.6 |
| 34.61 | -18.4 |
| 34.63 | -2.3 |
| 34.65 | 33.8 |
| 34.67 | 11.8 |
| 34.69 | 4.2 |
| 34.71 | -21.8 |
| 34.73 | 20.9 |
| 34.75 | 9.7 |
| 34.77 | 34.3 |
| 34.79 | -2.2 |
| 34.81 | -20 |
| 34.83 | 5.6 |
| 34.85 | 17.5 |
| 34.87 | 26.2 |
| 34.89 | -9.6 |
| 34.91 | 16.2 |
| 34.93 | -12.4 |
| 34.95 | 35.7 |
| 34.97 | 28.2 |
| 34.99 | 59.4 |
| 35.01 | 30.3 |
| 35.03 | 16.4 |
| 35.05 | 18.7 |
| 35.07 | 31.9 |
| 35.09 | 41.5 |
| 35.11 | 14.3 |
| 35.13 | 48.7 |
| 35.15 | 96.8 |
| 35.17 | 58.8 |
| 35.19 | 112.4 |
| 35.21 | 157.7 |
| 35.23 | 205.5 |
| 35.25 | 273.8 |
| 35.27 | 306.2 |
| 35.29 | 362.7 |
| 35.31 | 589.6 |
| 35.33 | 822.7 |
| 35.35 | 1222 |
| 35.37 | 1757.5 |
| 35.39 | 2546.5 |
| 35.41 | 3277.1 |
| 35.43 | 3440.2 |
| 35.45 | 3072.5 |
| 35.47 | 2482.5 |
| 35.49 | 2045.3 |
| 35.51 | 1793.2 |
| 35.53 | 1305 |
| 35.55 | 651.3 |
| 35.57 | -37.9 |
| 35.59 | -477.4 |
| 35.61 | -807.2 |
| 35.63 | -806 |
| 35.65 | -643.1 |
| 35.67 | -612.9 |
| 35.69 | -471.9 |
| 35.71 | -476.8 |
| 35.73 | -338.7 |
| 35.75 | -180.3 |
| 35.77 | -162.9 |
| 35.79 | -67.4 |
| 35.81 | -15.2 |
| 35.83 | -50.7 |
| 35.85 | -53.5 |
| 35.87 | -44 |
| 35.89 | -35.2 |
| 35.91 | -51 |
| 35.93 | 8.8 |
| 35.95 | 2.7 |
| 35.97 | 49.6 |
| 35.99 | 18.6 |
| 36.01 | -3.7 |
| 36.03 | -33.3 |
| 36.05 | -0.5 |
| 36.07 | -0.5 |
| 36.09 | 11.7 |
| 36.11 | -23.5 |
| 36.13 | 33.5 |
| 36.15 | 37.7 |
| 36.17 | 34.5 |
| 36.19 | 7.1 |
| 36.21 | -11 |
| 36.23 | -9 |
| 36.25 | 1.7 |
| 36.27 | 30.1 |
| 36.29 | -0.2 |
| 36.31 | -2.9 |
| 36.33 | 18.6 |
| 36.35 | 29.4 |
| 36.37 | 38.5 |
| 36.39 | 12.6 |
| 36.41 | 6.1 |
| 36.43 | 33.6 |
| 36.45 | 27.4 |
| 36.47 | 15.3 |
| 36.49 | -32.6 |
| 36.51 | 17.2 |
| 36.53 | -8.4 |
| 36.55 | 13.1 |
| 36.57 | 24.6 |
| 36.59 | 13.2 |
| 36.61 | 18 |
| 36.63 | -7.6 |
| 36.65 | 7.9 |
| 36.67 | -22.8 |
| 36.69 | -20.8 |
| 36.71 | -8.3 |
| 36.73 | 8 |
| 36.75 | -13.6 |
| 36.77 | 35.2 |
| 36.79 | 30.7 |
| 36.81 | -14.1 |
| 36.83 | 25.4 |
| 36.85 | 6.7 |
| 36.87 | -37.3 |
| 36.89 | 23.8 |
| 36.91 | 9.6 |
| 36.93 | -7.7 |
| 36.95 | -6.3 |
| 36.97 | -3.8 |
| 36.99 | -9.9 |
| 37.01 | 36.6 |
| 37.03 | 34.2 |
| 37.05 | 24.9 |
| 37.07 | -2.2 |
| 37.09 | -3 |
| 37.11 | 6.8 |
| 37.13 | 11.2 |
| 37.15 | -39.3 |
| 37.17 | 4.2 |
| 37.19 | 2.6 |
| 37.21 | -13.8 |
| 37.23 | 19.2 |
| 37.25 | -4.5 |
| 37.27 | -6.6 |
| 37.29 | -9.9 |
| 37.31 | -5 |
| 37.33 | 36 |
| 37.35 | 19.2 |
| 37.37 | 24.7 |
| 37.39 | -22.9 |
| 37.41 | -0.3 |
| 37.43 | -41.1 |
| 37.45 | 16.2 |
| 37.47 | -13.1 |
| 37.49 | -0.5 |
| 37.51 | 5.2 |
| 37.53 | 7.6 |
| 37.55 | 26 |
| 37.57 | 1.4 |
| 37.59 | 38.4 |
| 37.61 | -11.2 |
| 37.63 | -17.4 |
| 37.65 | -10 |
| 37.67 | -12.5 |
| 37.69 | 7.3 |
| 37.71 | -2.9 |
| 37.73 | 28.2 |
| 37.75 | 23.9 |
| 37.77 | -6.5 |
| 37.79 | 25.2 |
| 37.81 | -4.1 |
| 37.83 | 7.4 |
| 37.85 | -22 |
| 37.87 | 0.7 |
| 37.89 | 23.5 |
| 37.91 | 6.4 |
| 37.93 | 17.6 |
| 37.95 | 34.6 |
| 37.97 | 1.9 |
| 37.99 | 10.6 |
| 38.01 | -7.2 |
| 38.03 | -31.7 |
| 38.05 | 43.1 |
| 38.07 | 47.4 |
| 38.09 | 26.1 |
| 38.11 | -6.2 |
| 38.13 | 29.8 |
| 38.15 | -13.2 |
| 38.17 | -13 |
| 38.19 | 0.2 |
| 38.21 | -23.4 |
| 38.23 | 16.3 |
| 38.25 | 16.3 |
| 38.27 | -5.6 |
| 38.29 | -14.6 |
| 38.31 | 21.7 |
| 38.33 | 3 |
| 38.35 | 6.9 |
| 38.37 | 9.4 |
| 38.39 | -24.2 |
| 38.41 | -2.6 |
| 38.43 | 26 |
| 38.45 | -10.1 |
| 38.47 | -0.9 |
| 38.49 | -17.4 |
| 38.51 | -42.7 |
| 38.53 | 6 |
| 38.55 | -35.2 |
| 38.57 | -49.5 |
| 38.59 | 20.7 |
| 38.61 | -31.9 |
| 38.63 | -6.8 |
| 38.65 | 5.3 |
| 38.67 | 8.2 |
| 38.69 | -5.1 |
| 38.71 | -19.1 |
| 38.73 | 18.1 |
| 38.75 | -45.8 |
| 38.77 | 3.2 |
| 38.79 | -9.5 |
| 38.81 | -3.7 |
| 38.83 | 1.2 |
| 38.85 | -36.7 |
| 38.87 | 8.1 |
| 38.89 | 15.8 |
| 38.91 | -6.6 |
| 38.93 | -3.5 |
| 38.95 | 3.3 |
| 38.97 | 29 |
| 38.99 | 0.4 |
| 39.01 | 0.5 |
| 39.03 | -20.5 |
| 39.05 | -16.7 |
| 39.07 | -14 |
| 39.09 | -23.5 |
| 39.11 | 5.8 |
| 39.13 | 11.1 |
| 39.15 | 3.9 |
| 39.17 | -30.6 |
| 39.19 | 23 |
| 39.21 | 7.4 |
| 39.23 | -14.9 |
| 39.25 | -10 |
| 39.27 | -4 |
| 39.29 | -21.9 |
| 39.31 | -18.7 |
| 39.33 | -8.8 |
| 39.35 | 8.1 |
| 39.37 | 13.9 |
| 39.39 | 48.8 |
| 39.41 | -13.9 |
| 39.43 | 5.4 |
| 39.45 | 2.5 |
| 39.47 | 10.8 |
| 39.49 | 8.3 |
| 39.51 | 8.8 |
| 39.53 | 22 |
| 39.55 | 19.7 |
| 39.57 | -23.4 |
| 39.59 | 1.3 |
| 39.61 | -25.4 |
| 39.63 | 13.9 |
| 39.65 | 4.6 |
| 39.67 | 7.7 |
| 39.69 | 3.2 |
| 39.71 | -0.8 |
| 39.73 | 6.9 |
| 39.75 | 20.3 |
| 39.77 | 9.2 |
| 39.79 | 16.6 |
| 39.81 | -14.1 |
| 39.83 | 1.8 |
| 39.85 | -1.9 |
| 39.87 | -23.5 |
| 39.89 | 4.4 |
| 39.91 | 11.1 |
| 39.93 | -3.5 |
| 39.95 | 10.4 |
| 39.97 | 23.2 |
| 39.99 | 3.4 |
| 40.01 | -21.2 |
| 40.03 | 5.9 |
| 40.05 | -33.6 |
| 40.07 | 0.5 |
| 40.09 | -6.1 |
| 40.11 | -54.2 |
| 40.13 | 29.9 |
| 40.15 | 12 |
| 40.17 | 14.4 |
| 40.19 | 3.4 |
| 40.21 | 26.1 |
| 40.23 | -6.3 |
| 40.25 | -10.4 |
| 40.27 | 37.9 |
| 40.29 | 4.7 |
| 40.31 | 29.8 |
| 40.33 | -18.5 |
| 40.35 | 4.7 |
| 40.37 | 3 |
| 40.39 | 29.4 |
| 40.41 | 5.3 |
| 40.43 | 25 |
| 40.45 | -26 |
| 40.47 | 17.9 |
| 40.49 | 16.8 |
| 40.51 | -14.3 |
| 40.53 | 10.2 |
| 40.55 | -2.1 |
| 40.57 | 24.3 |
| 40.59 | -49.8 |
| 40.61 | -7.4 |
| 40.63 | -24.5 |
| 40.65 | -14.6 |
| 40.67 | 30.1 |
| 40.69 | 2.9 |
| 40.71 | -39 |
| 40.73 | -7.7 |
| 40.75 | 1.4 |
| 40.77 | -12.2 |
| 40.79 | 2.9 |
| 40.81 | -18.7 |
| 40.83 | 11.7 |
| 40.85 | -21.5 |
| 40.87 | -46 |
| 40.89 | 24.9 |
| 40.91 | -26.3 |
| 40.93 | 27.5 |
| 40.95 | -25.8 |
| 40.97 | 1.4 |
| 40.99 | 28.1 |
| 41.01 | -15 |
| 41.03 | -43.9 |
| 41.05 | 10.1 |
| 41.07 | -7 |
| 41.09 | 31 |
| 41.11 | -6.8 |
| 41.13 | 25.5 |
| 41.15 | -21.2 |
| 41.17 | -24.4 |
| 41.19 | 3.1 |
| 41.21 | -4.9 |
| 41.23 | -12.7 |
| 41.25 | 7.6 |
| 41.27 | 26.4 |
| 41.29 | -11.9 |
| 41.31 | -14.9 |
| 41.33 | -21.6 |
| 41.35 | 12.8 |
| 41.37 | 4.1 |
| 41.39 | 39.6 |
| 41.41 | 2.3 |
| 41.43 | 41.7 |
| 41.45 | 8.1 |
| 41.47 | -2 |
| 41.49 | -26.6 |
| 41.51 | 1.6 |
| 41.53 | -2.6 |
| 41.55 | -11.3 |
| 41.57 | 0.8 |
| 41.59 | 5.2 |
| 41.61 | -5.8 |
| 41.63 | -14.7 |
| 41.65 | -4.9 |
| 41.67 | 3.2 |
| 41.69 | 12.9 |
| 41.71 | 3.8 |
| 41.73 | -0.7 |
| 41.75 | -5.4 |
| 41.77 | 0.2 |
| 41.79 | 24 |
| 41.81 | 10.8 |
| 41.83 | -43.2 |
| 41.85 | -9.2 |
| 41.87 | -8.3 |
| 41.89 | 18.5 |
| 41.91 | 14.5 |
| 41.93 | -11.1 |
| 41.95 | 21 |
| 41.97 | -38.7 |
| 41.99 | 18.2 |
| 42.01 | -18 |
| 42.03 | 18.8 |
| 42.05 | 30.7 |
| 42.07 | 23.2 |
| 42.09 | 40.8 |
| 42.11 | 13.2 |
| 42.13 | 22.7 |
| 42.15 | 14.1 |
| 42.17 | 30.5 |
| 42.19 | -24.7 |
| 42.21 | 14.1 |
| 42.23 | -0.5 |
| 42.25 | -24.4 |
| 42.27 | 16.7 |
| 42.29 | -25 |
| 42.31 | 19.6 |
| 42.33 | 11.2 |
| 42.35 | 11.6 |
| 42.37 | 28.5 |
| 42.39 | -22.9 |
| 42.41 | 31.1 |
| 42.43 | 16.4 |
| 42.45 | 23.7 |
| 42.47 | 24.3 |
| 42.49 | -5.1 |
| 42.51 | 18.9 |
| 42.53 | -14.9 |
| 42.55 | -14.4 |
| 42.57 | -32.8 |
| 42.59 | 13.6 |
| 42.61 | -11.6 |
| 42.63 | 12.7 |
| 42.65 | 14 |
| 42.67 | -9.8 |
| 42.69 | 5.1 |
| 42.71 | 18.6 |
| 42.73 | 26.8 |
| 42.75 | 7.1 |
| 42.77 | 0.8 |
| 42.79 | 15.1 |
| 42.81 | 11 |
| 42.83 | 3.9 |
| 42.85 | 12.4 |
| 42.87 | -9.9 |
| 42.89 | 1.2 |
| 42.91 | 20.2 |
| 42.93 | 23.3 |
| 42.95 | 11.9 |
| 42.97 | -8.9 |
| 42.99 | 4.4 |
| 43.01 | 3.7 |
| 43.03 | 32.9 |
| 43.05 | 11 |
| 43.07 | 6.6 |
| 43.09 | -2 |
| 43.11 | 3.9 |
| 43.13 | 16.8 |
| 43.15 | 18.8 |
| 43.17 | 21.8 |
| 43.19 | -23.1 |
| 43.21 | -12.7 |
| 43.23 | 50 |
| 43.25 | 17.2 |
| 43.27 | -12 |
| 43.29 | -12.7 |
| 43.31 | 15.9 |
| 43.33 | 9 |
| 43.35 | 19.9 |
| 43.37 | 34.5 |
| 43.39 | -21.4 |
| 43.41 | 10.8 |
| 43.43 | 1.4 |
| 43.45 | 10.1 |
| 43.47 | -10.5 |
| 43.49 | 2 |
| 43.51 | -4.3 |
| 43.53 | 32.3 |
| 43.55 | 39.4 |
| 43.57 | 3.7 |
| 43.59 | 30.5 |
| 43.61 | 14.4 |
| 43.63 | 11.6 |
| 43.65 | 12.9 |
| 43.67 | 5.7 |
| 43.69 | -14.1 |
| 43.71 | 6.3 |
| 43.73 | -13.6 |
| 43.75 | -2.3 |
| 43.77 | 11.1 |
| 43.79 | -9 |
| 43.81 | 14.7 |
| 43.83 | 30.1 |
| 43.85 | -18 |
| 43.87 | -4.4 |
| 43.89 | 2.1 |
| 43.91 | 1.9 |
| 43.93 | 18.6 |
| 43.95 | 29.8 |
| 43.97 | 29.3 |
| 43.99 | -0.5 |
| 44.01 | -16.8 |
| 44.03 | 5.1 |
| 44.05 | -14 |
| 44.07 | 10.7 |
| 44.09 | 19.7 |
| 44.11 | 28.4 |
| 44.13 | -14.7 |
| 44.15 | -4.4 |
| 44.17 | 34.3 |
| 44.19 | -8.2 |
| 44.21 | -18.8 |
| 44.23 | -21 |
| 44.25 | 23.3 |
| 44.27 | 24.5 |
| 44.29 | 14.2 |
| 44.31 | 12 |
| 44.33 | 1.5 |
| 44.35 | 36.9 |
| 44.37 | 9.7 |
| 44.39 | 33 |
| 44.41 | -11 |
| 44.43 | -7.1 |
| 44.45 | -6.5 |
| 44.47 | 42.4 |
| 44.49 | 30.3 |
| 44.51 | 5.7 |
| 44.53 | 53.4 |
| 44.55 | -7 |
| 44.57 | 17.5 |
| 44.59 | -18.3 |
| 44.61 | 13.8 |
| 44.63 | 34.3 |
| 44.65 | 11.3 |
| 44.67 | 10.5 |
| 44.69 | -40 |
| 44.71 | 46.2 |
| 44.73 | 15.5 |
| 44.75 | 11.9 |
| 44.77 | 19.3 |
| 44.79 | 28.7 |
| 44.81 | 17.5 |
| 44.83 | 7.5 |
| 44.85 | 8.1 |
| 44.87 | 33.2 |
| 44.89 | 26 |
| 44.91 | -13.6 |
| 44.93 | 16.1 |
| 44.95 | 6.1 |
| 44.97 | -3.5 |
| 44.99 | 10.9 |
| 45.01 | 28.9 |
| 45.03 | -4.3 |
| 45.05 | 17.6 |
| 45.07 | 42 |
| 45.09 | -25.8 |
| 45.11 | 17.5 |
| 45.13 | 13.4 |
| 45.15 | 12.5 |
| 45.17 | -3.2 |
| 45.19 | 16.3 |
| 45.21 | -18.7 |
| 45.23 | 35.2 |
| 45.25 | 13.5 |
| 45.27 | -3.2 |
| 45.29 | -19.8 |
| 45.31 | -30.8 |
| 45.33 | -8.1 |
| 45.35 | 17.4 |
| 45.37 | 12.6 |
| 45.39 | -5.6 |
| 45.41 | -10.5 |
| 45.43 | 17.9 |
| 45.45 | -5.3 |
| 45.47 | 34.1 |
| 45.49 | 35 |
| 45.51 | 5 |
| 45.53 | 5 |
| 45.55 | 47.5 |
| 45.57 | 3.8 |
| 45.59 | 10.7 |
| 45.61 | 60.2 |
| 45.63 | 16.3 |
| 45.65 | -9.1 |
| 45.67 | -7.6 |
| 45.69 | 8.1 |
| 45.71 | 8.1 |
| 45.73 | -3.8 |
| 45.75 | 63.7 |
| 45.77 | -5.2 |
| 45.79 | 0.8 |
| 45.81 | -31 |
| 45.83 | 36.5 |
| 45.85 | 6.5 |
| 45.87 | -26.1 |
| 45.89 | -1.8 |
| 45.91 | 16.3 |
| 45.93 | 7.1 |
| 45.95 | -3.8 |
| 45.97 | 4.5 |
| 45.99 | 42.5 |
| 46.01 | 9 |
| 46.03 | 17.1 |
| 46.05 | -20.2 |
| 46.07 | 2 |
| 46.09 | 7.4 |
| 46.11 | 3.7 |
| 46.13 | 36.1 |
| 46.15 | 4.9 |
| 46.17 | 0.7 |
| 46.19 | -1.2 |
| 46.21 | 38.7 |
| 46.23 | -18.5 |
| 46.25 | 3.2 |
| 46.27 | -6.6 |
| 46.29 | 52.6 |
| 46.31 | -9.9 |
| 46.33 | -37.4 |
| 46.35 | 1.3 |
| 46.37 | 25.7 |
| 46.39 | 41.1 |
| 46.41 | 19.7 |
| 46.43 | -18.5 |
| 46.45 | 50.4 |
| 46.47 | 42 |
| 46.49 | 21.4 |
| 46.51 | 9.2 |
| 46.53 | 5.6 |
| 46.55 | 0.2 |
| 46.57 | 28.4 |
| 46.59 | 2.2 |
| 46.61 | 7.6 |
| 46.63 | 43.8 |
| 46.65 | -16.2 |
| 46.67 | -8.7 |
| 46.69 | 6.5 |
| 46.71 | 7 |
| 46.73 | 35.9 |
| 46.75 | 4.1 |
| 46.77 | 53.4 |
| 46.79 | 11.8 |
| 46.81 | 33.6 |
| 46.83 | 46.5 |
| 46.85 | 18.7 |
| 46.87 | 0.2 |
| 46.89 | 18.3 |
| 46.91 | -11 |
| 46.93 | 15 |
| 46.95 | 68.3 |
| 46.97 | 18.7 |
| 46.99 | -1.3 |
| 47.01 | 26 |
| 47.03 | 19.5 |
| 47.05 | -9.5 |
| 47.07 | 18.1 |
| 47.09 | 26.1 |
| 47.11 | -5.7 |
| 47.13 | -10.8 |
| 47.15 | 20.5 |
| 47.17 | -12.7 |
| 47.19 | 21 |
| 47.21 | 4.7 |
| 47.23 | 12.7 |
| 47.25 | -16.8 |
| 47.27 | -1.4 |
| 47.29 | 33.5 |
| 47.31 | 14.7 |
| 47.33 | 17.5 |
| 47.35 | -4.1 |
| 47.37 | 21.3 |
| 47.39 | 2.2 |
| 47.41 | 31.4 |
| 47.43 | 50.7 |
| 47.45 | 25.5 |
| 47.47 | 19.9 |
| 47.49 | 52.7 |
| 47.51 | 1 |
| 47.53 | 3.9 |
| 47.55 | 5.6 |
| 47.57 | 6.6 |
| 47.59 | 10.3 |
| 47.61 | 26.4 |
| 47.63 | 8.3 |
| 47.65 | -14 |
| 47.67 | 30.2 |
| 47.69 | 26.2 |
| 47.71 | 44.4 |
| 47.73 | 7.2 |
| 47.75 | 11.5 |
| 47.77 | 48 |
| 47.79 | 6.8 |
| 47.81 | 10.4 |
| 47.83 | 10.7 |
| 47.85 | 20.4 |
| 47.87 | -6.4 |
| 47.89 | 12.6 |
| 47.91 | 9.5 |
| 47.93 | 20.8 |
| 47.95 | 19.5 |
| 47.97 | 13.5 |
| 47.99 | -3.4 |
| 48.01 | 23.1 |
| 48.03 | 18.9 |
| 48.05 | 13.5 |
| 48.07 | 9.9 |
| 48.09 | 6.8 |
| 48.11 | 7.9 |
| 48.13 | 8.6 |
| 48.15 | -4.5 |
| 48.17 | 9 |
| 48.19 | 27.8 |
| 48.21 | 23.5 |
| 48.23 | 15.5 |
| 48.25 | 28.6 |
| 48.27 | 4 |
| 48.29 | 24.3 |
| 48.31 | 6.1 |
| 48.33 | 15.8 |
| 48.35 | 3.1 |
| 48.37 | 31.8 |
| 48.39 | -11.2 |
| 48.41 | 21.8 |
| 48.43 | 27.9 |
| 48.45 | 17.7 |
| 48.47 | 10.8 |
| 48.49 | 21.7 |
| 48.51 | 22.6 |
| 48.53 | 18.7 |
| 48.55 | -14.9 |
| 48.57 | 2.8 |
| 48.59 | 37.2 |
| 48.61 | 19.5 |
| 48.63 | -9.4 |
| 48.65 | -7.8 |
| 48.67 | 11.1 |
| 48.69 | -7.5 |
| 48.71 | 14.3 |
| 48.73 | 16 |
| 48.75 | 23.4 |
| 48.77 | 24.5 |
| 48.79 | 11.4 |
| 48.81 | 1.5 |
| 48.83 | 5.7 |
| 48.85 | 30.3 |
| 48.87 | -4.3 |
| 48.89 | 14.2 |
| 48.91 | 26.8 |
| 48.93 | 17.9 |
| 48.95 | -2 |
| 48.97 | -21.4 |
| 48.99 | 10 |
| 49.01 | 41.8 |
| 49.03 | 34.5 |
| 49.05 | 11.1 |
| 49.07 | 35.3 |
| 49.09 | 24.4 |
| 49.11 | 11.2 |
| 49.13 | 8.9 |
| 49.15 | 15.7 |
| 49.17 | 7.3 |
| 49.19 | 36.6 |
| 49.21 | 23.4 |
| 49.23 | 4.4 |
| 49.25 | 46.2 |
| 49.27 | 20.3 |
| 49.29 | 28.4 |
| 49.31 | -6.5 |
| 49.33 | 27.1 |
| 49.35 | 19.6 |
| 49.37 | 9.4 |
| 49.39 | 12.6 |
| 49.41 | 4.8 |
| 49.43 | 26.3 |
| 49.45 | 31.6 |
| 49.47 | 19 |
| 49.49 | 5.4 |
| 49.51 | 10 |
| 49.53 | 9.2 |
| 49.55 | 2.5 |
| 49.57 | -6.1 |
| 49.59 | 19.1 |
| 49.61 | 18.4 |
| 49.63 | 40.9 |
| 49.65 | 24.5 |
| 49.67 | 18.6 |
| 49.69 | 13.1 |
| 49.71 | 24.5 |
| 49.73 | -16.4 |
| 49.75 | 0 |
| 49.77 | 43.1 |
| 49.79 | 50.6 |
| 49.81 | 6.5 |
| 49.83 | 8.1 |
| 49.85 | 0.4 |
| 49.87 | 9.7 |
| 49.89 | 20.4 |
| 49.91 | -10.4 |
| 49.93 | 51.4 |
| 49.95 | 34.9 |
| 49.97 | 3.3 |
| 49.99 | 23.5 |
| 50.01 | -2.8 |
| 50.03 | 36 |
| 50.05 | 15.4 |
| 50.07 | 46 |
| 50.09 | 29.8 |
| 50.11 | 11.4 |
| 50.13 | -1.8 |
| 50.15 | 20.4 |
| 50.17 | 27.7 |
| 50.19 | 31.3 |
| 50.21 | 72.1 |
| 50.23 | 18.1 |
| 50.25 | -19 |
| 50.27 | 33.4 |
| 50.29 | 33.4 |
| 50.31 | 22.1 |
| 50.33 | 26.8 |
| 50.35 | 5.5 |
| 50.37 | 35.3 |
| 50.39 | 6.3 |
| 50.41 | 11 |
| 50.43 | 22.7 |
| 50.45 | 24.4 |
| 50.47 | 2.1 |
| 50.49 | 23.4 |
| 50.51 | -1.9 |
| 50.53 | 8.9 |
| 50.55 | 22.3 |
| 50.57 | -1.4 |
| 50.59 | 23.1 |
| 50.61 | 6.1 |
| 50.63 | 8.4 |
| 50.65 | 18.1 |
| 50.67 | 5.6 |
| 50.69 | 16.1 |
| 50.71 | 21.6 |
| 50.73 | 24.3 |
| 50.75 | 17.1 |
| 50.77 | -0.6 |
| 50.79 | -22.4 |
| 50.81 | 31.6 |
| 50.83 | 45.4 |
| 50.85 | 2.5 |
| 50.87 | 26.5 |
| 50.89 | 27.1 |
| 50.91 | 9.7 |
| 50.93 | 1.5 |
| 50.95 | 32.6 |
| 50.97 | 16.3 |
| 50.99 | 10.6 |
| 51.01 | 19.6 |
| 51.03 | 20.5 |
| 51.05 | 3.9 |
| 51.07 | 24.7 |
| 51.09 | 3.5 |
| 51.11 | 6.6 |
| 51.13 | 43.6 |
| 51.15 | 33.4 |
| 51.17 | 16.8 |
| 51.19 | 18.7 |
| 51.21 | 18.6 |
| 51.23 | 56.2 |
| 51.25 | -8.4 |
| 51.27 | 35.4 |
| 51.29 | 42.8 |
| 51.31 | 54.9 |
| 51.33 | 62 |
| 51.35 | 107.6 |
| 51.37 | 202.6 |
| 51.39 | 299.1 |
| 51.41 | 398.9 |
| 51.43 | 399.8 |
| 51.45 | 324.6 |
| 51.47 | 229.3 |
| 51.49 | 134.9 |
| 51.51 | 156 |
| 51.53 | 161.2 |
| 51.55 | 165.7 |
| 51.57 | 156.2 |
| 51.59 | 85.5 |
| 51.61 | 50.6 |
| 51.63 | 14.7 |
| 51.65 | 40.9 |
| 51.67 | 18.1 |
| 51.69 | 19.6 |
| 51.71 | 2.5 |
| 51.73 | -11.2 |
| 51.75 | 15.1 |
| 51.77 | 12 |
| 51.79 | 7.4 |
| 51.81 | 8.2 |
| 51.83 | 5.3 |
| 51.85 | 19.3 |
| 51.87 | 35.7 |
| 51.89 | 1.2 |
| 51.91 | 55.3 |
| 51.93 | 11.3 |
| 51.95 | 20.5 |
| 51.97 | 31.2 |
| 51.99 | 16.9 |
| 52.01 | -1.5 |
| 52.03 | 35.2 |
| 52.05 | 22.4 |
| 52.07 | 13.3 |
| 52.09 | 16.8 |
| 52.11 | 22.2 |
| 52.13 | 16.7 |
| 52.15 | 7.4 |
| 52.17 | 12 |
| 52.19 | 30.5 |
| 52.21 | 20.8 |
| 52.23 | 27.2 |
| 52.25 | 9.9 |
| 52.27 | 28.9 |
| 52.29 | 3.4 |
| 52.31 | 22.5 |
| 52.33 | 31.7 |
| 52.35 | 10.5 |
| 52.37 | 29.1 |
| 52.39 | 15.4 |
| 52.41 | 42.8 |
| 52.43 | 17.2 |
| 52.45 | 1.2 |
| 52.47 | 3.9 |
| 52.49 | 6.7 |
| 52.51 | 7.1 |
| 52.53 | -13.4 |
| 52.55 | 23.8 |
| 52.57 | 25 |
| 52.59 | 29.6 |
| 52.61 | 27.1 |
| 52.63 | 42.6 |
| 52.65 | 35 |
| 52.67 | -19.3 |
| 52.69 | -9.9 |
| 52.71 | 36.5 |
| 52.73 | -1.2 |
| 52.75 | 16.1 |
| 52.77 | -12.1 |
| 52.79 | 29.2 |
| 52.81 | 3.1 |
| 52.83 | 18 |
| 52.85 | 32.2 |
| 52.87 | 3.4 |
| 52.89 | -5.4 |
| 52.91 | 30.1 |
| 52.93 | 14 |
| 52.95 | 4 |
| 52.97 | -14.1 |
| 52.99 | 28.3 |
| 53.01 | -27.8 |
| 53.03 | -11.3 |
| 53.05 | -5.9 |
| 53.07 | 45.9 |
| 53.09 | 13.3 |
| 53.11 | -3.1 |
| 53.13 | -6.2 |
| 53.15 | 7.8 |
| 53.17 | 7.6 |
| 53.19 | 26.6 |
| 53.21 | 26.7 |
| 53.23 | 5.2 |
| 53.25 | 18.4 |
| 53.27 | -1.9 |
| 53.29 | 3.9 |
| 53.31 | 11.5 |
| 53.33 | 23.6 |
| 53.35 | 41.4 |
| 53.37 | 2.8 |
| 53.39 | 28.2 |
| 53.41 | 32.8 |
| 53.43 | 42.4 |
| 53.45 | -9.3 |
| 53.47 | -0.5 |
| 53.49 | 17.1 |
| 53.51 | 15.3 |
| 53.53 | 4.1 |
| 53.55 | 26.4 |
| 53.57 | 11.2 |
| 53.59 | 19.4 |
| 53.61 | 17.8 |
| 53.63 | 8.3 |
| 53.65 | 19.6 |
| 53.67 | 16.4 |
| 53.69 | 11.3 |
| 53.71 | 10.7 |
| 53.73 | 10.1 |
| 53.75 | -4.1 |
| 53.77 | 7.2 |
| 53.79 | 0.4 |
| 53.81 | 13.8 |
| 53.83 | -8.9 |
| 53.85 | 14.2 |
| 53.87 | 0.3 |
| 53.89 | -5.5 |
| 53.91 | 38.8 |
| 53.93 | 4.1 |
| 53.95 | 26.1 |
| 53.97 | 34.7 |
| 53.99 | 8.5 |
| 54.01 | 34.5 |
| 54.03 | 42.1 |
| 54.05 | 6.5 |
| 54.07 | 42.4 |
| 54.09 | 14 |
| 54.11 | 8.1 |
| 54.13 | -1.1 |
| 54.15 | 24.5 |
| 54.17 | 15.2 |
| 54.19 | 9.4 |
| 54.21 | 18.6 |
| 54.23 | 43.6 |
| 54.25 | 16.8 |
| 54.27 | 4.7 |
| 54.29 | 16.1 |
| 54.31 | 2.9 |
| 54.33 | -3.3 |
| 54.35 | 7.8 |
| 54.37 | 30.2 |
| 54.39 | 34.1 |
| 54.41 | 8.6 |
| 54.43 | 4 |
| 54.45 | 15.1 |
| 54.47 | 14.1 |
| 54.49 | 28 |
| 54.51 | -5.7 |
| 54.53 | 41.8 |
| 54.55 | 11.1 |
| 54.57 | 26.7 |
| 54.59 | 8.6 |
| 54.61 | 31.8 |
| 54.63 | 28.1 |
| 54.65 | 18.2 |
| 54.67 | 2.5 |
| 54.69 | 13.9 |
| 54.71 | -0.7 |
| 54.73 | 24.5 |
| 54.75 | 17.7 |
| 54.77 | 22.9 |
| 54.79 | 27.3 |
| 54.81 | 13.3 |
| 54.83 | 15.7 |
| 54.85 | 6.7 |
| 54.87 | 16.6 |
| 54.89 | 17.2 |
| 54.91 | 11.4 |
| 54.93 | 13.7 |
| 54.95 | 10.1 |
| 54.97 | 19.9 |
| 54.99 | 10.4 |